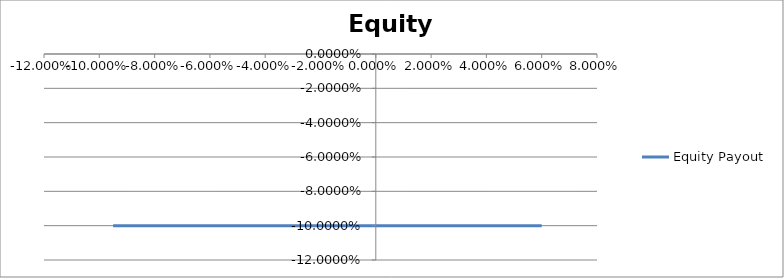
| Category | Equity Payout |
|---|---|
| 0.06 | -0.1 |
| 0.055 | -0.1 |
| 0.05 | -0.1 |
| 0.045000000000000005 | -0.1 |
| 0.04000000000000001 | -0.1 |
| 0.03500000000000001 | -0.1 |
| 0.03000000000000001 | -0.1 |
| 0.02500000000000001 | -0.1 |
| 0.020000000000000007 | -0.1 |
| 0.015000000000000006 | -0.1 |
| 0.010000000000000005 | -0.1 |
| 0.005000000000000005 | -0.1 |
| 0.0 | -0.1 |
| -0.005 | -0.1 |
| -0.01 | -0.1 |
| -0.015 | -0.1 |
| -0.02 | -0.1 |
| -0.025 | -0.1 |
| -0.030000000000000002 | -0.1 |
| -0.035 | -0.1 |
| -0.04 | -0.1 |
| -0.045 | -0.1 |
| -0.049999999999999996 | -0.1 |
| -0.05499999999999999 | -0.1 |
| -0.05999999999999999 | -0.1 |
| -0.06499999999999999 | -0.1 |
| -0.06999999999999999 | -0.1 |
| -0.075 | -0.1 |
| -0.08 | -0.1 |
| -0.085 | -0.1 |
| -0.09000000000000001 | -0.1 |
| -0.09500000000000001 | -0.1 |